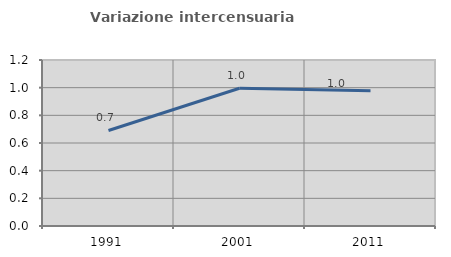
| Category | Variazione intercensuaria annua |
|---|---|
| 1991.0 | 0.691 |
| 2001.0 | 0.996 |
| 2011.0 | 0.977 |